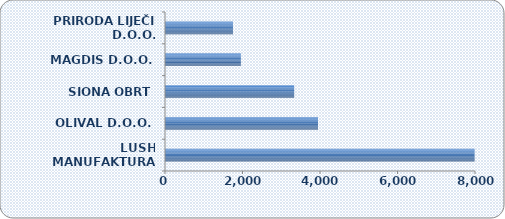
| Category | Series 0 |
|---|---|
| LUSH MANUFAKTURA D.O.O. | 7989.243 |
| OLIVAL D.O.O. | 3949.045 |
| SIONA OBRT | 3332.972 |
| MAGDIS D.O.O. | 1957.566 |
| PRIRODA LIJEČI D.O.O. | 1754.072 |